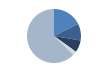
| Category | Series 0 |
|---|---|
| ARRASTRE | 127 |
| CERCO | 72 |
| PALANGRE | 52 |
| REDES DE ENMALLE | 17 |
| ARTES MENORES | 451 |
| SIN TIPO ASIGNADO | 0 |